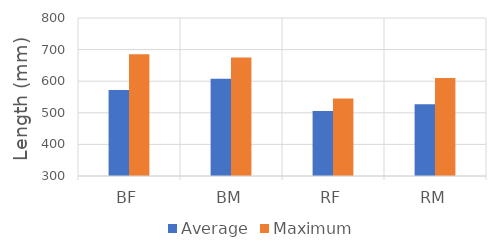
| Category | Average | Maximum |
|---|---|---|
| BF | 572 | 685 |
| BM | 608 | 675 |
| RF | 506 | 545 |
| RM | 527 | 610 |